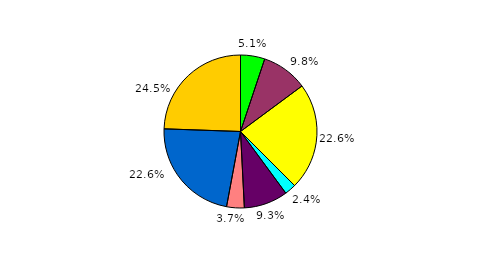
| Category | Series 0 |
|---|---|
| 0 | 5.127 |
| 1 | 9.734 |
| 2 | 22.634 |
| 3 | 2.417 |
| 4 | 9.279 |
| 5 | 3.729 |
| 6 | 22.634 |
| 7 | 24.444 |